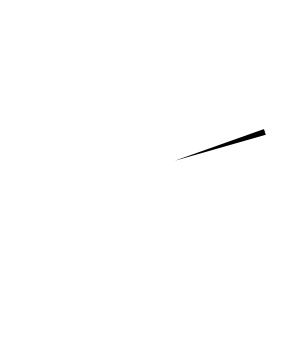
| Category | Series 0 |
|---|---|
| Valor Final | 45 |
| Incremento | 1 |
| Valor Inicial | 55 |